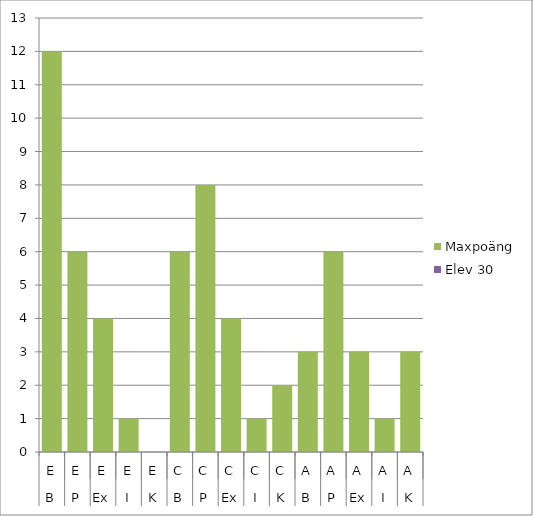
| Category | Maxpoäng | Elev 30 |
|---|---|---|
| 0 | 12 | 0 |
| 1 | 6 | 0 |
| 2 | 4 | 0 |
| 3 | 1 | 0 |
| 4 | 0 | 0 |
| 5 | 6 | 0 |
| 6 | 8 | 0 |
| 7 | 4 | 0 |
| 8 | 1 | 0 |
| 9 | 2 | 0 |
| 10 | 3 | 0 |
| 11 | 6 | 0 |
| 12 | 3 | 0 |
| 13 | 1 | 0 |
| 14 | 3 | 0 |